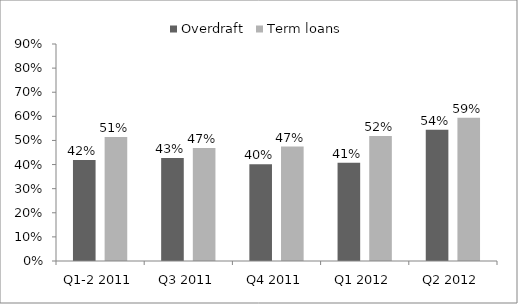
| Category | Overdraft | Term loans |
|---|---|---|
| Q1-2 2011 | 0.419 | 0.514 |
| Q3 2011 | 0.427 | 0.469 |
| Q4 2011 | 0.401 | 0.475 |
| Q1 2012 | 0.408 | 0.518 |
| Q2 2012 | 0.544 | 0.595 |